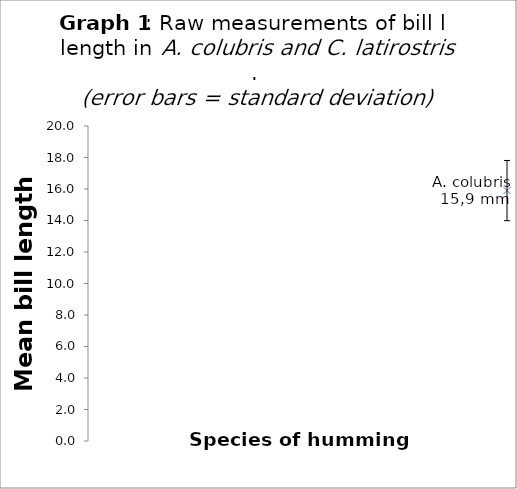
| Category | Series 0 |
|---|---|
| 0 | 15.9 |
| 1 | 18.8 |